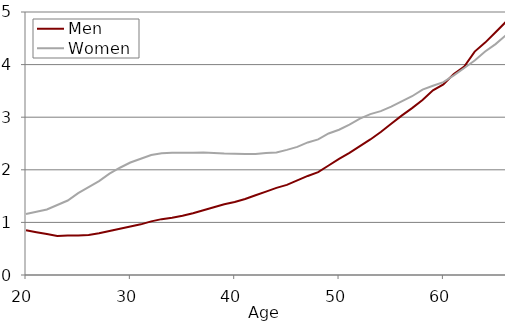
| Category | Men | Women |
|---|---|---|
| 20.0 | 0.85 | 1.161 |
| 21.0 | 0.814 | 1.204 |
| 22.0 | 0.779 | 1.246 |
| 23.0 | 0.743 | 1.331 |
| 24.0 | 0.75 | 1.416 |
| 25.0 | 0.752 | 1.558 |
| 26.0 | 0.762 | 1.671 |
| 27.0 | 0.793 | 1.784 |
| 28.0 | 0.835 | 1.926 |
| 29.0 | 0.878 | 2.039 |
| 30.0 | 0.92 | 2.138 |
| 31.0 | 0.963 | 2.209 |
| 32.0 | 1.02 | 2.28 |
| 33.0 | 1.062 | 2.315 |
| 34.0 | 1.09 | 2.322 |
| 35.0 | 1.126 | 2.325 |
| 36.0 | 1.175 | 2.326 |
| 37.0 | 1.232 | 2.327 |
| 38.0 | 1.289 | 2.319 |
| 39.0 | 1.345 | 2.309 |
| 40.0 | 1.388 | 2.305 |
| 41.0 | 1.444 | 2.301 |
| 42.0 | 1.515 | 2.298 |
| 43.0 | 1.586 | 2.319 |
| 44.0 | 1.657 | 2.329 |
| 45.0 | 1.713 | 2.379 |
| 46.0 | 1.798 | 2.436 |
| 47.0 | 1.883 | 2.52 |
| 48.0 | 1.954 | 2.577 |
| 49.0 | 2.082 | 2.69 |
| 50.0 | 2.209 | 2.761 |
| 51.0 | 2.322 | 2.86 |
| 52.0 | 2.45 | 2.974 |
| 53.0 | 2.577 | 3.059 |
| 54.0 | 2.719 | 3.115 |
| 55.0 | 2.874 | 3.2 |
| 56.0 | 3.03 | 3.299 |
| 57.0 | 3.172 | 3.398 |
| 58.0 | 3.328 | 3.526 |
| 59.0 | 3.512 | 3.597 |
| 60.0 | 3.625 | 3.667 |
| 61.0 | 3.823 | 3.795 |
| 62.0 | 3.965 | 3.936 |
| 63.0 | 4.248 | 4.078 |
| 64.0 | 4.418 | 4.248 |
| 65.0 | 4.616 | 4.39 |
| 66.0 | 4.814 | 4.56 |